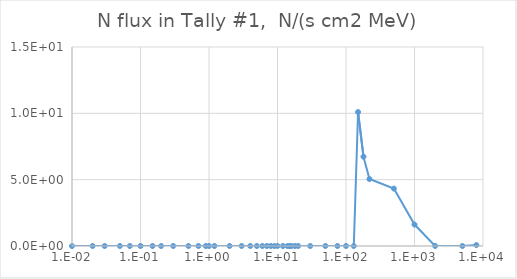
| Category | Series 0 |
|---|---|
| 1e-09 | 0 |
| 1e-08 | 0 |
| 2.5e-08 | 0 |
| 1e-07 | 0 |
| 2e-07 | 0 |
| 5e-07 | 0 |
| 1e-06 | 0 |
| 2e-06 | 0 |
| 5e-06 | 0 |
| 1e-05 | 0 |
| 2e-05 | 0 |
| 5e-05 | 0 |
| 0.0001 | 0 |
| 0.0002 | 0 |
| 0.0005 | 0 |
| 0.001 | 0 |
| 0.002 | 0 |
| 0.005 | 0 |
| 0.01 | 0 |
| 0.02 | 0 |
| 0.03 | 0 |
| 0.05 | 0 |
| 0.07 | 0 |
| 0.1 | 0 |
| 0.15 | 0 |
| 0.2 | 0 |
| 0.3 | 0 |
| 0.5 | 0 |
| 0.7 | 0 |
| 0.9 | 0 |
| 1.0 | 0 |
| 1.2 | 0 |
| 2.0 | 0 |
| 3.0 | 0 |
| 4.0 | 0 |
| 5.0 | 0 |
| 6.0 | 0 |
| 7.0 | 0 |
| 8.0 | 0 |
| 9.0 | 0 |
| 10.0 | 0 |
| 12.0 | 0 |
| 14.0 | 0 |
| 15.0 | 0 |
| 16.0 | 0 |
| 18.0 | 0 |
| 20.0 | 0 |
| 30.0 | 0 |
| 50.0 | 0 |
| 75.0 | 0 |
| 100.0 | 0 |
| 130.0 | 0 |
| 150.0 | 10.098 |
| 180.0 | 6.732 |
| 220.0 | 5.049 |
| 500.0 | 4.328 |
| 1000.0 | 1.616 |
| 2000.0 | 0 |
| 5000.0 | 0 |
| 8000.0 | 0.067 |